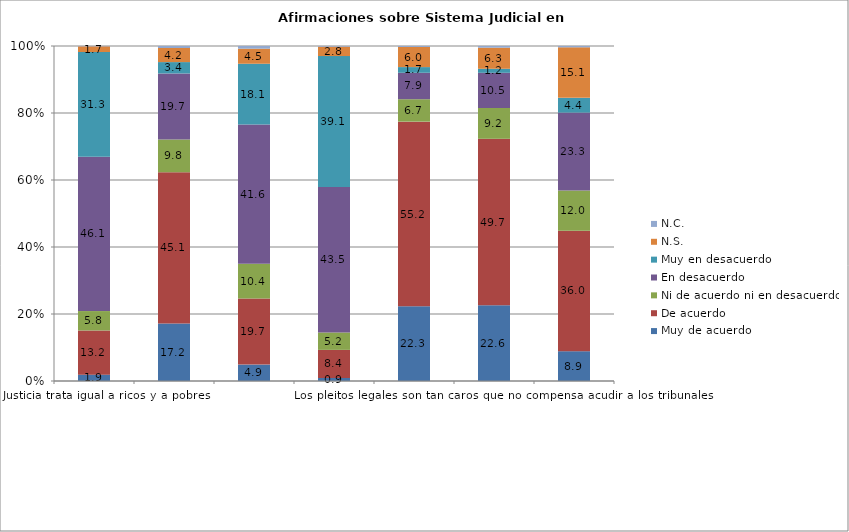
| Category | Muy de acuerdo | De acuerdo | Ni de acuerdo ni en desacuerdo | En desacuerdo | Muy en desacuerdo | N.S.  | N.C.  |
|---|---|---|---|---|---|---|---|
| La Justicia trata igual a ricos y a pobres | 1.9 | 13.2 | 5.8 | 46.1 | 31.3 | 1.7 | 0.1 |
| Los procesos judiciales son tan complicados que no merece la pena meterse en ellos | 17.2 | 45.1 | 9.8 | 19.7 | 3.4 | 4.2 | 0.6 |
| Los tribunales protegen a los ciudadanos de los poderosos  | 4.9 | 19.7 | 10.4 | 41.6 | 18.1 | 4.5 | 0.8 |
| La Justicia trata igual a un político que a un ciudadano corriente | 0.9 | 8.4 | 5.2 | 43.5 | 39.1 | 2.8 | 0.2 |
| Si los tribunales fueran más rápidos, recurriríamos a ellos con más frecuencia | 22.3 | 55.2 | 6.7 | 7.9 | 1.7 | 6 | 0.3 |
| Los pleitos legales son tan caros que no compensa acudir a los tribunales | 22.6 | 49.7 | 9.2 | 10.5 | 1.2 | 6.3 | 0.5 |
| Los medios de comunicación determinan las decisiones de la Justicia | 8.9 | 36 | 12 | 23.3 | 4.4 | 15.1 | 0.4 |